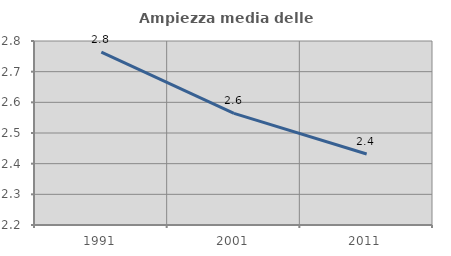
| Category | Ampiezza media delle famiglie |
|---|---|
| 1991.0 | 2.764 |
| 2001.0 | 2.564 |
| 2011.0 | 2.432 |